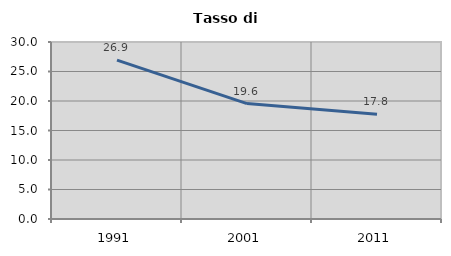
| Category | Tasso di disoccupazione   |
|---|---|
| 1991.0 | 26.92 |
| 2001.0 | 19.564 |
| 2011.0 | 17.758 |